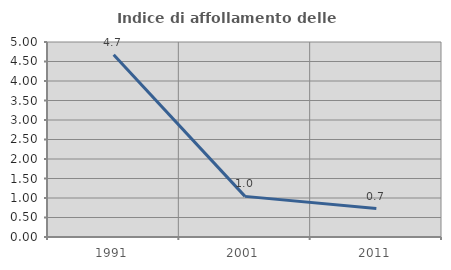
| Category | Indice di affollamento delle abitazioni  |
|---|---|
| 1991.0 | 4.673 |
| 2001.0 | 1.042 |
| 2011.0 | 0.73 |